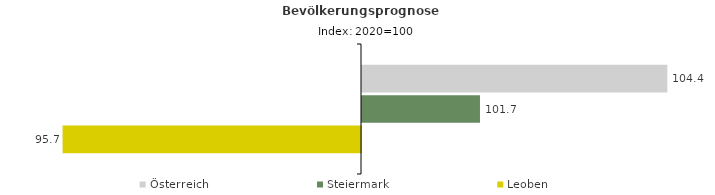
| Category | Österreich | Steiermark | Leoben |
|---|---|---|---|
| 2020.0 | 104.4 | 101.7 | 95.7 |